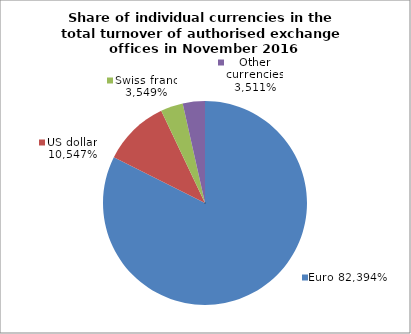
| Category | EUR |
|---|---|
| 0.716079492598274 | 0.824 |
| 0.2839199572999224 | 0.105 |
| 5.501018035729667e-07 | 0.035 |